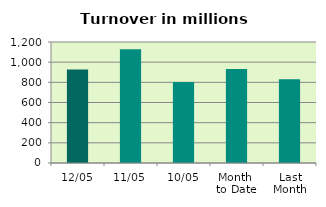
| Category | Series 0 |
|---|---|
| 12/05 | 928.369 |
| 11/05 | 1127.883 |
| 10/05 | 802.485 |
| Month 
to Date | 932.215 |
| Last
Month | 829.993 |